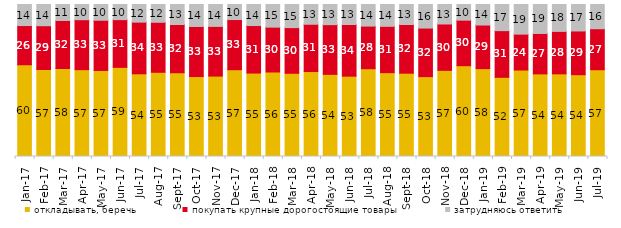
| Category | откладывать, беречь | покупать крупные дорогостоящие товары | затрудняюсь ответить |
|---|---|---|---|
| 2017-01-01 | 60.35 | 25.8 | 13.85 |
| 2017-02-01 | 56.8 | 28.6 | 13.85 |
| 2017-03-01 | 57.9 | 31.6 | 10.5 |
| 2017-04-01 | 57.1 | 32.85 | 10 |
| 2017-05-01 | 56.6 | 33.05 | 10.35 |
| 2017-06-01 | 58.65 | 31.4 | 9.95 |
| 2017-07-01 | 54.4 | 34 | 11.6 |
| 2017-08-01 | 55.4 | 32.9 | 11.7 |
| 2017-09-01 | 55.1 | 31.75 | 13.15 |
| 2017-10-01 | 52.6 | 32.95 | 14.45 |
| 2017-11-01 | 52.9 | 32.7 | 14.4 |
| 2017-12-01 | 57.1 | 33 | 9.9 |
| 2018-01-01 | 54.9 | 31.25 | 13.85 |
| 2018-02-01 | 55.6 | 29.5 | 14.9 |
| 2018-03-01 | 54.75 | 30.05 | 15.2 |
| 2018-04-01 | 55.9 | 31.1 | 13 |
| 2018-05-01 | 54.05 | 32.7 | 13.25 |
| 2018-06-01 | 52.85 | 34 | 13.15 |
| 2018-07-01 | 57.75 | 28.05 | 14.2 |
| 2018-08-01 | 55.15 | 30.5 | 14.35 |
| 2018-09-01 | 54.8 | 32.05 | 13.15 |
| 2018-10-01 | 52.55 | 31.95 | 15.5 |
| 2018-11-01 | 56.687 | 30.489 | 12.824 |
| 2018-12-01 | 59.75 | 29.95 | 10.3 |
| 2019-01-01 | 57.8 | 28.7 | 13.5 |
| 2019-02-01 | 52.1 | 30.7 | 17.2 |
| 2019-03-01 | 56.887 | 23.62 | 19.493 |
| 2019-04-01 | 54.356 | 26.584 | 19.059 |
| 2019-05-01 | 54.383 | 27.935 | 17.682 |
| 2019-06-01 | 53.815 | 28.778 | 17.406 |
| 2019-07-01 | 57.079 | 26.98 | 15.941 |